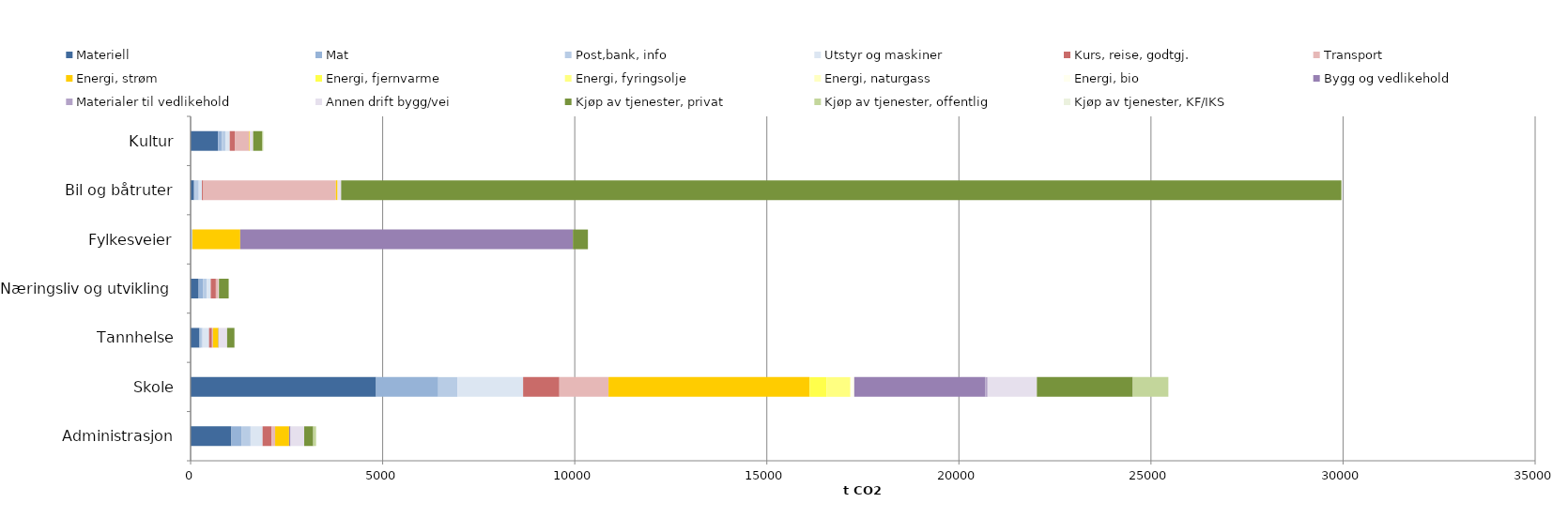
| Category | Materiell | Mat | Post,bank, info | Utstyr og maskiner | Kurs, reise, godtgj. | Transport | Energi, strøm | Energi, fjernvarme | Energi, fyringsolje | Energi, naturgass | Energi, bio | Bygg og vedlikehold | Materialer til vedlikehold | Annen drift bygg/vei | Kjøp av tjenester, privat | Kjøp av tjenester, offentlig | Kjøp av tjenester, KF/IKS |
|---|---|---|---|---|---|---|---|---|---|---|---|---|---|---|---|---|---|
| Administrasjon | 1062.272 | 260.592 | 238.092 | 312.526 | 235.774 | 91.693 | 363 | 0 | 0 | 0 | 0 | 36.054 | 1.409 | 355.821 | 234.818 | 74.623 | 0 |
| Skole | 4828.221 | 1617.851 | 500.913 | 1708.768 | 943.528 | 1279.536 | 5232.75 | 441 | 623 | 1.25 | 98.1 | 3413.404 | 57.487 | 1283.802 | 2497.241 | 925.679 | 0 |
| Tannhelse | 229.635 | 33.671 | 47.304 | 169.503 | 77.005 | 25.744 | 140 | 0 | 0 | 0 | 0 | 8.654 | 0 | 219.061 | 190.677 | 0.259 | 0 |
| Næringsliv og utvikling | 209.725 | 119.683 | 93.421 | 100.855 | 133.831 | 67.592 | 0 | 0 | 0 | 0 | 0 | 0 | 0 | 12.29 | 254.008 | 0.942 | 0 |
| Fylkesveier | 9.945 | 0 | 34.09 | 1.491 | 0.422 | 1.205 | 1244.75 | 0 | 0 | 0 | 0 | 8659.612 | 0 | 0 | 391.431 | 0 | 0 |
| Bil og båtruter | 89.249 | 4.006 | 119.546 | 81.986 | 35.42 | 3452.336 | 43 | 0 | 0 | 0 | 0 | 0.718 | 0.282 | 92.398 | 26037.641 | 0 | 0 |
| Kultur | 715.537 | 96.241 | 93.88 | 113.12 | 130.882 | 373.892 | 14.5 | 0 | 0 | 0 | 0 | 1.633 | 0.376 | 88.864 | 236.894 | 23.517 | 0 |